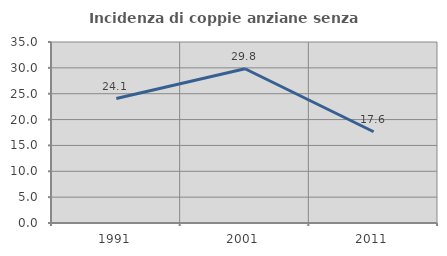
| Category | Incidenza di coppie anziane senza figli  |
|---|---|
| 1991.0 | 24.074 |
| 2001.0 | 29.825 |
| 2011.0 | 17.647 |